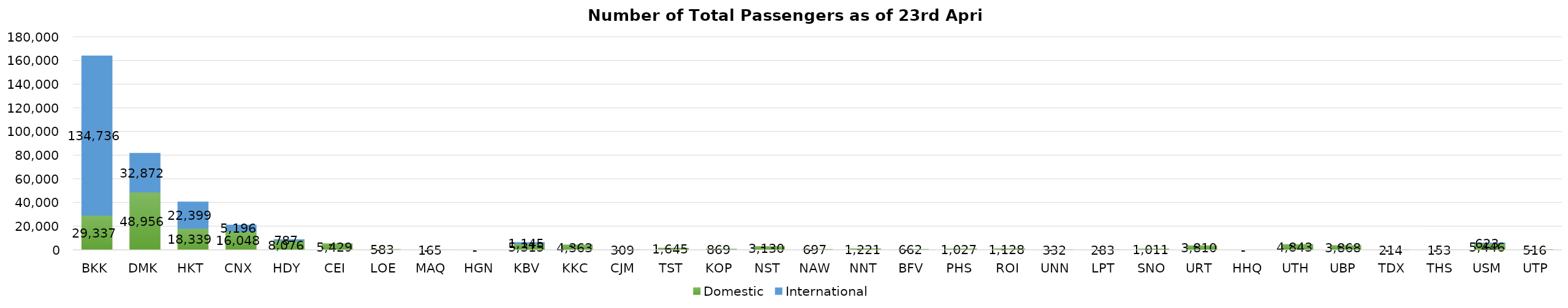
| Category | Domestic | International |
|---|---|---|
| BKK | 29337 | 134736 |
| DMK | 48956 | 32872 |
| HKT | 18339 | 22399 |
| CNX | 16048 | 5196 |
| HDY | 8076 | 787 |
| CEI | 5429 | 0 |
| LOE | 583 | 0 |
| MAQ | 165 | 0 |
| HGN | 0 | 0 |
| KBV | 5315 | 1145 |
| KKC | 4363 | 0 |
| CJM | 309 | 0 |
| TST | 1645 | 0 |
| KOP | 869 | 0 |
| NST | 3130 | 0 |
| NAW | 697 | 0 |
| NNT | 1221 | 0 |
| BFV | 662 | 0 |
| PHS | 1027 | 0 |
| ROI | 1128 | 0 |
| UNN | 332 | 0 |
| LPT | 283 | 0 |
| SNO | 1011 | 0 |
| URT | 3810 | 0 |
| HHQ | 0 | 0 |
| UTH | 4843 | 0 |
| UBP | 3868 | 0 |
| TDX | 214 | 0 |
| THS | 153 | 0 |
| USM | 5446 | 623 |
| UTP | 516 | 0 |